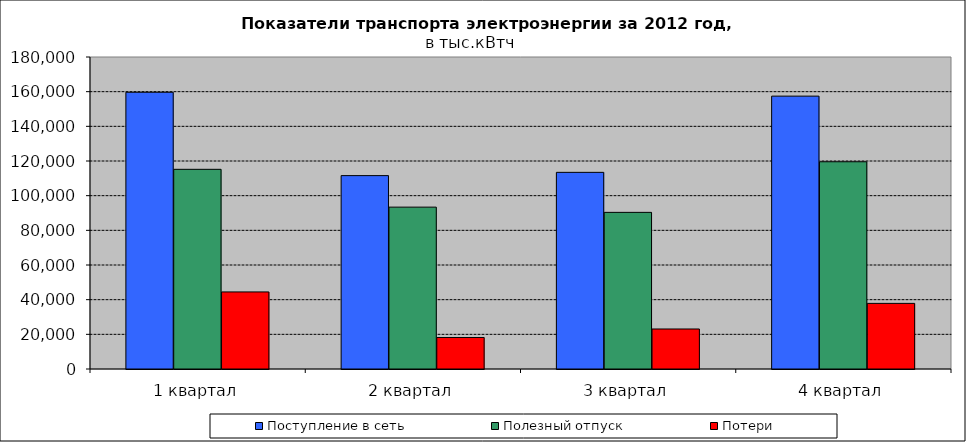
| Category | Поступление в сеть | Полезный отпуск | Потери |
|---|---|---|---|
| 1 квартал | 159660.032 | 115195.518 | 44464.514 |
| 2 квартал | 111567.998 | 93388.938 | 18179.06 |
| 3 квартал | 113454.606 | 90369.188 | 23085.418 |
| 4 квартал | 157419.518 | 119561.174 | 37858.344 |